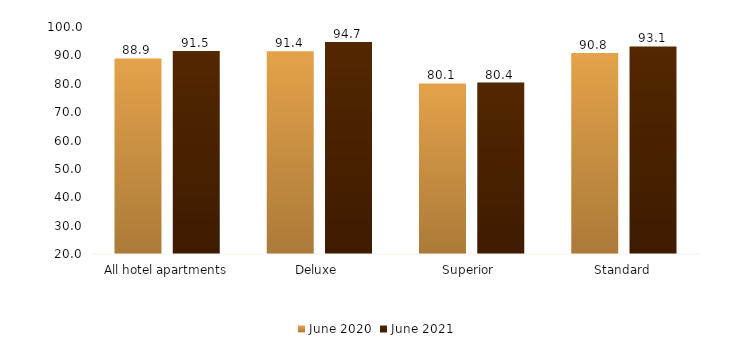
| Category | June 2020 | June 2021 |
|---|---|---|
| All hotel apartments | 88.936 | 91.539 |
| Deluxe  | 91.422 | 94.743 |
| Superior  | 80.096 | 80.431 |
| Standard | 90.846 | 93.136 |